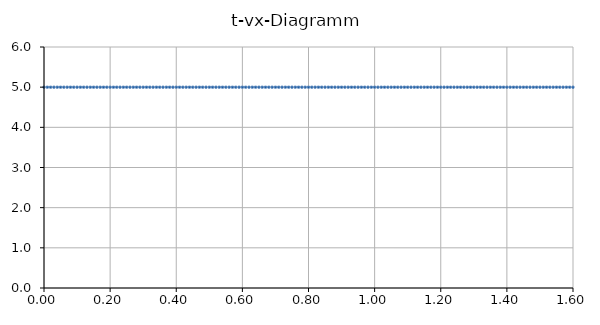
| Category | Series 0 |
|---|---|
| 0.0 | 5 |
| 0.01 | 5 |
| 0.02 | 5 |
| 0.03 | 5 |
| 0.04 | 5 |
| 0.05 | 5 |
| 0.06 | 5 |
| 0.07 | 5 |
| 0.08 | 5 |
| 0.09 | 5 |
| 0.1 | 5 |
| 0.11 | 5 |
| 0.12 | 5 |
| 0.13 | 5 |
| 0.14 | 5 |
| 0.15 | 5 |
| 0.16 | 5 |
| 0.17 | 5 |
| 0.18 | 5 |
| 0.19 | 5 |
| 0.2 | 5 |
| 0.21 | 5 |
| 0.22 | 5 |
| 0.23 | 5 |
| 0.24 | 5 |
| 0.25 | 5 |
| 0.26 | 5 |
| 0.27 | 5 |
| 0.28 | 5 |
| 0.29 | 5 |
| 0.3 | 5 |
| 0.31 | 5 |
| 0.32 | 5 |
| 0.33 | 5 |
| 0.34 | 5 |
| 0.35 | 5 |
| 0.36 | 5 |
| 0.37 | 5 |
| 0.38 | 5 |
| 0.39 | 5 |
| 0.4 | 5 |
| 0.41 | 5 |
| 0.42 | 5 |
| 0.43 | 5 |
| 0.44 | 5 |
| 0.45 | 5 |
| 0.46 | 5 |
| 0.47 | 5 |
| 0.48 | 5 |
| 0.49 | 5 |
| 0.5 | 5 |
| 0.51 | 5 |
| 0.52 | 5 |
| 0.53 | 5 |
| 0.54 | 5 |
| 0.55 | 5 |
| 0.56 | 5 |
| 0.57 | 5 |
| 0.58 | 5 |
| 0.59 | 5 |
| 0.6 | 5 |
| 0.61 | 5 |
| 0.62 | 5 |
| 0.63 | 5 |
| 0.64 | 5 |
| 0.65 | 5 |
| 0.66 | 5 |
| 0.67 | 5 |
| 0.68 | 5 |
| 0.69 | 5 |
| 0.7 | 5 |
| 0.71 | 5 |
| 0.72 | 5 |
| 0.73 | 5 |
| 0.74 | 5 |
| 0.75 | 5 |
| 0.76 | 5 |
| 0.77 | 5 |
| 0.78 | 5 |
| 0.790000000000001 | 5 |
| 0.8 | 5 |
| 0.810000000000001 | 5 |
| 0.82 | 5 |
| 0.83 | 5 |
| 0.84 | 5 |
| 0.850000000000001 | 5 |
| 0.860000000000001 | 5 |
| 0.87 | 5 |
| 0.88 | 5 |
| 0.890000000000001 | 5 |
| 0.900000000000001 | 5 |
| 0.910000000000001 | 5 |
| 0.92 | 5 |
| 0.930000000000001 | 5 |
| 0.940000000000001 | 5 |
| 0.950000000000001 | 5 |
| 0.960000000000001 | 5 |
| 0.970000000000001 | 5 |
| 0.980000000000001 | 5 |
| 0.990000000000001 | 5 |
| 1.0 | 5 |
| 1.01 | 5 |
| 1.02 | 5 |
| 1.03 | 5 |
| 1.04 | 5 |
| 1.05 | 5 |
| 1.06 | 5 |
| 1.07 | 5 |
| 1.08 | 5 |
| 1.09 | 5 |
| 1.1 | 5 |
| 1.11 | 5 |
| 1.12 | 5 |
| 1.13 | 5 |
| 1.14 | 5 |
| 1.15 | 5 |
| 1.16 | 5 |
| 1.17 | 5 |
| 1.18 | 5 |
| 1.19 | 5 |
| 1.2 | 5 |
| 1.21 | 5 |
| 1.22 | 5 |
| 1.23 | 5 |
| 1.24 | 5 |
| 1.25 | 5 |
| 1.26 | 5 |
| 1.27 | 5 |
| 1.28 | 5 |
| 1.29 | 5 |
| 1.3 | 5 |
| 1.31 | 5 |
| 1.32 | 5 |
| 1.33 | 5 |
| 1.34 | 5 |
| 1.35 | 5 |
| 1.36 | 5 |
| 1.37 | 5 |
| 1.38 | 5 |
| 1.39 | 5 |
| 1.4 | 5 |
| 1.41 | 5 |
| 1.42 | 5 |
| 1.43 | 5 |
| 1.44 | 5 |
| 1.45 | 5 |
| 1.46 | 5 |
| 1.47 | 5 |
| 1.48 | 5 |
| 1.49 | 5 |
| 1.5 | 5 |
| 1.51 | 5 |
| 1.52 | 5 |
| 1.53 | 5 |
| 1.54 | 5 |
| 1.55 | 5 |
| 1.56 | 5 |
| 1.57 | 5 |
| 1.58 | 5 |
| 1.59 | 5 |
| 1.6 | 5 |